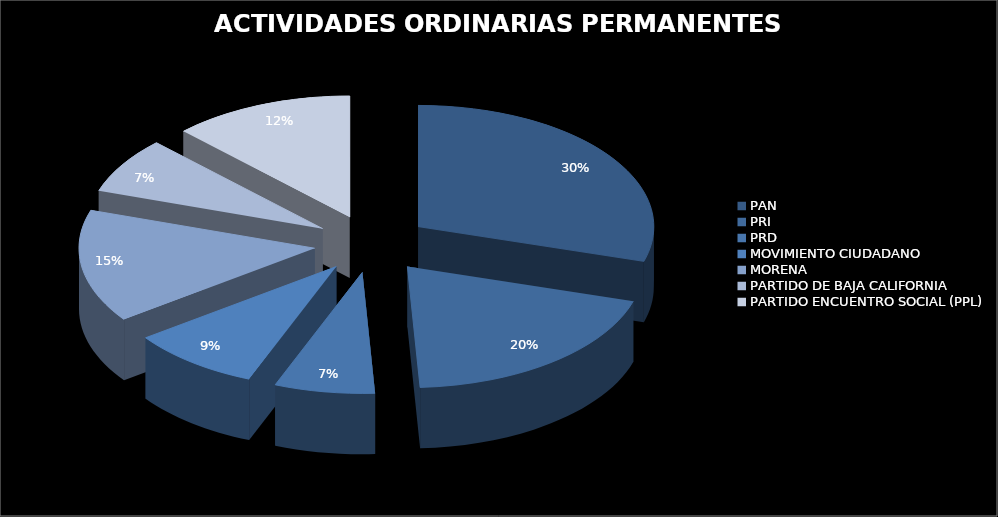
| Category | Series 0 |
|---|---|
| PAN | 34759042.01 |
| PRI | 22880242.82 |
| PRD | 8077068.91 |
| MOVIMIENTO CIUDADANO | 10519547.28 |
| MORENA | 17677164.39 |
| PARTIDO DE BAJA CALIFORNIA | 8765526.78 |
| PARTIDO ENCUENTRO SOCIAL (PPL) | 14609441.53 |